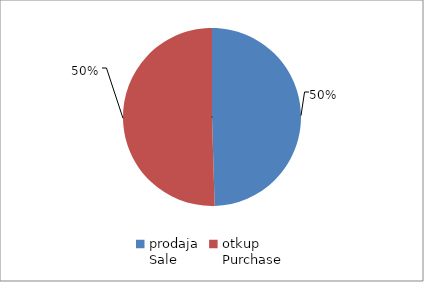
| Category | Series 0 |
|---|---|
| prodaja
Sale | 12620353.76 |
| otkup
Purchase | 12864290.5 |